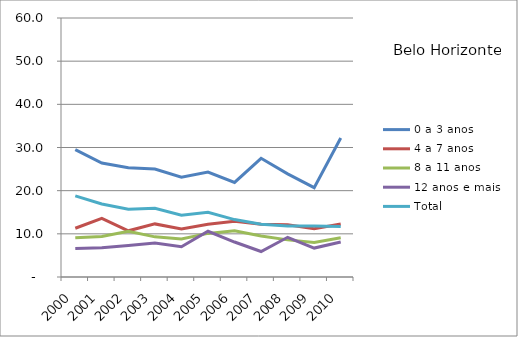
| Category | 0 a 3 anos | 4 a 7 anos | 8 a 11 anos | 12 anos e mais | Total |
|---|---|---|---|---|---|
| 2000.0 | 29.5 | 11.3 | 9.1 | 6.6 | 18.8 |
| 2001.0 | 26.4 | 13.6 | 9.4 | 6.8 | 16.9 |
| 2002.0 | 25.3 | 10.7 | 10.6 | 7.3 | 15.7 |
| 2003.0 | 25 | 12.3 | 9.3 | 7.9 | 15.9 |
| 2004.0 | 23.1 | 11.1 | 8.8 | 7 | 14.3 |
| 2005.0 | 24.3 | 12.2 | 10.1 | 10.6 | 15 |
| 2006.0 | 21.9 | 12.9 | 10.7 | 8.1 | 13.3 |
| 2007.0 | 27.5 | 12.2 | 9.5 | 5.9 | 12.2 |
| 2008.0 | 23.9 | 12.1 | 8.6 | 9.2 | 11.8 |
| 2009.0 | 20.7 | 11.2 | 8 | 6.7 | 11.8 |
| 2010.0 | 32.2 | 12.3 | 9.1 | 8.1 | 11.7 |